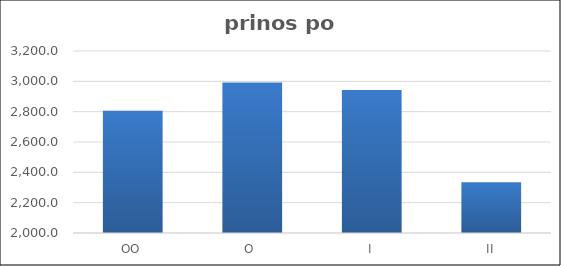
| Category | Series 0 |
|---|---|
| OO | 2806 |
| O  | 2993 |
| I | 2943 |
| II | 2335 |